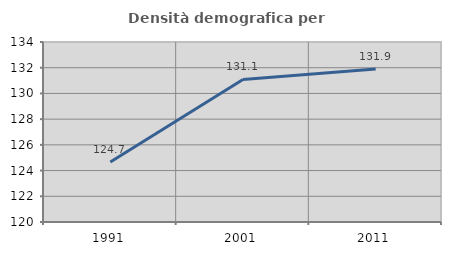
| Category | Densità demografica |
|---|---|
| 1991.0 | 124.663 |
| 2001.0 | 131.089 |
| 2011.0 | 131.892 |